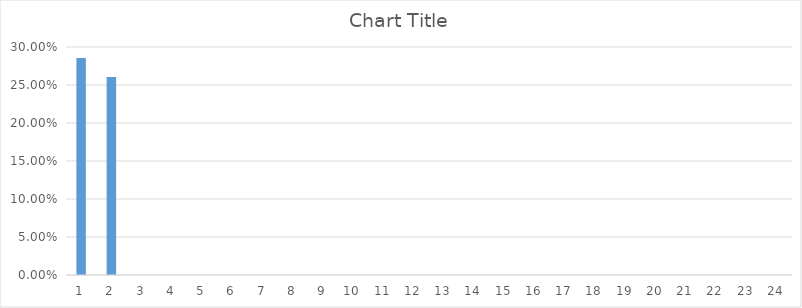
| Category | Series 0 |
|---|---|
| 0 | 0.286 |
| 1 | 0.261 |
| 2 | 0 |
| 3 | 0 |
| 4 | 0 |
| 5 | 0 |
| 6 | 0 |
| 7 | 0 |
| 8 | 0 |
| 9 | 0 |
| 10 | 0 |
| 11 | 0 |
| 12 | 0 |
| 13 | 0 |
| 14 | 0 |
| 15 | 0 |
| 16 | 0 |
| 17 | 0 |
| 18 | 0 |
| 19 | 0 |
| 20 | 0 |
| 21 | 0 |
| 22 | 0 |
| 23 | 0 |